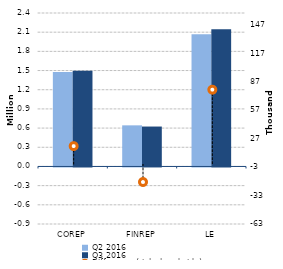
| Category | Q2 2016 | Q3 2016 |
|---|---|---|
| 0 | 1476281 | 1495609 |
| 1/1/00 | 642897 | 624268 |
| 1/2/00 | 2067156 | 2146112 |